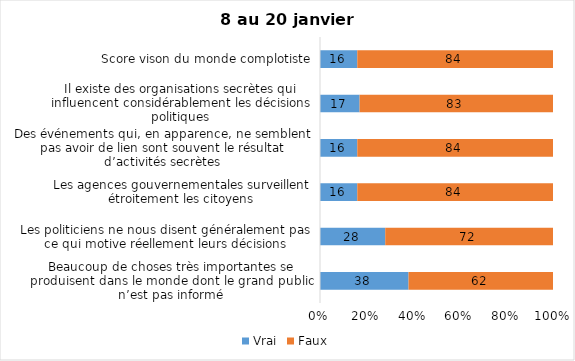
| Category | Vrai | Faux |
|---|---|---|
| Beaucoup de choses très importantes se produisent dans le monde dont le grand public n’est pas informé | 38 | 62 |
| Les politiciens ne nous disent généralement pas ce qui motive réellement leurs décisions | 28 | 72 |
| Les agences gouvernementales surveillent étroitement les citoyens | 16 | 84 |
| Des événements qui, en apparence, ne semblent pas avoir de lien sont souvent le résultat d’activités secrètes | 16 | 84 |
| Il existe des organisations secrètes qui influencent considérablement les décisions politiques | 17 | 83 |
| Score vison du monde complotiste | 16 | 84 |